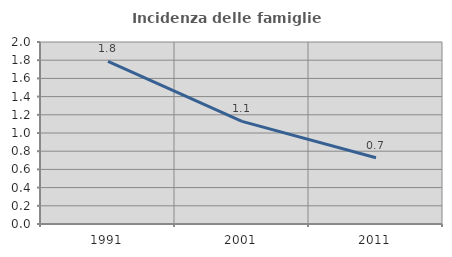
| Category | Incidenza delle famiglie numerose |
|---|---|
| 1991.0 | 1.787 |
| 2001.0 | 1.128 |
| 2011.0 | 0.728 |